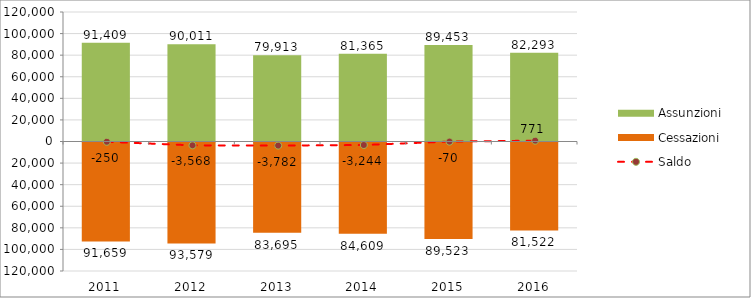
| Category | Assunzioni | Cessazioni |
|---|---|---|
| 2011.0 | 91409 | -91659 |
| 2012.0 | 90011 | -93579 |
| 2013.0 | 79913 | -83695 |
| 2014.0 | 81365 | -84609 |
| 2015.0 | 89453 | -89523 |
| 2016.0 | 82293 | -81522 |